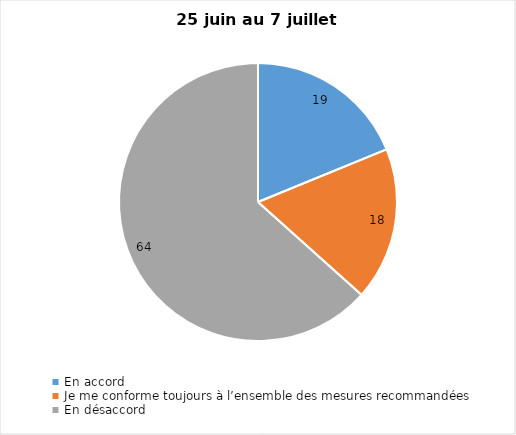
| Category | Series 0 |
|---|---|
| En accord | 19 |
| Je me conforme toujours à l’ensemble des mesures recommandées | 18 |
| En désaccord | 64 |